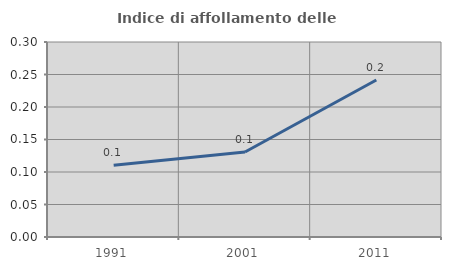
| Category | Indice di affollamento delle abitazioni  |
|---|---|
| 1991.0 | 0.11 |
| 2001.0 | 0.131 |
| 2011.0 | 0.242 |